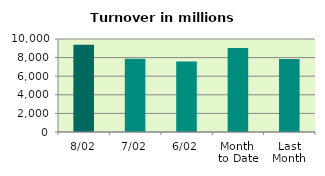
| Category | Series 0 |
|---|---|
| 8/02 | 9387.804 |
| 7/02 | 7872.32 |
| 6/02 | 7572.516 |
| Month 
to Date | 9042.407 |
| Last
Month | 7855.802 |